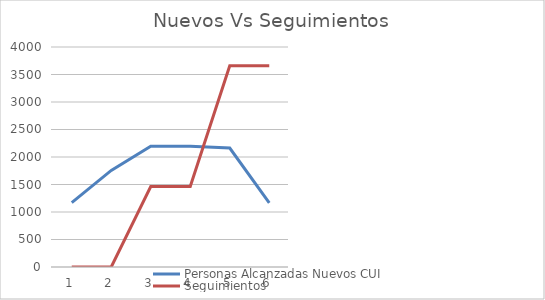
| Category | Personas Alcanzadas Nuevos CUI | Seguimientos |
|---|---|---|
| 0 | 1170.84 | 0 |
| 1 | 1756.26 | 0 |
| 2 | 2195.325 | 1463.55 |
| 3 | 2195.325 | 1463.55 |
| 4 | 2162.062 | 3658.875 |
| 5 | 1164.188 | 3658.875 |